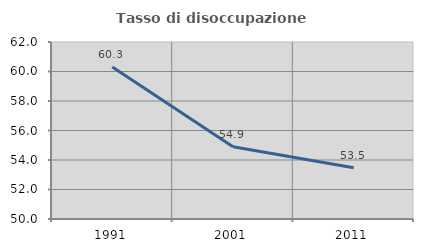
| Category | Tasso di disoccupazione giovanile  |
|---|---|
| 1991.0 | 60.301 |
| 2001.0 | 54.903 |
| 2011.0 | 53.471 |